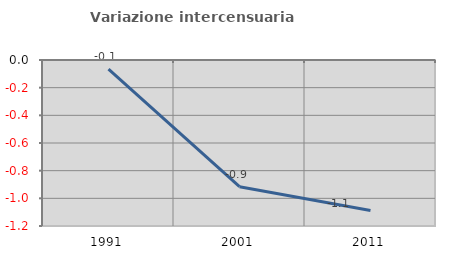
| Category | Variazione intercensuaria annua |
|---|---|
| 1991.0 | -0.065 |
| 2001.0 | -0.916 |
| 2011.0 | -1.088 |